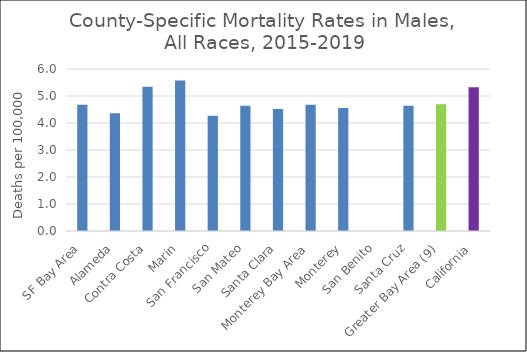
| Category | Male |
|---|---|
| SF Bay Area | 4.68 |
|   Alameda | 4.36 |
|   Contra Costa | 5.34 |
|   Marin | 5.57 |
|   San Francisco | 4.27 |
|   San Mateo | 4.64 |
|   Santa Clara | 4.52 |
| Monterey Bay Area | 4.68 |
|   Monterey | 4.56 |
|   San Benito | 0 |
|   Santa Cruz | 4.64 |
| Greater Bay Area (9) | 4.69 |
| California | 5.32 |